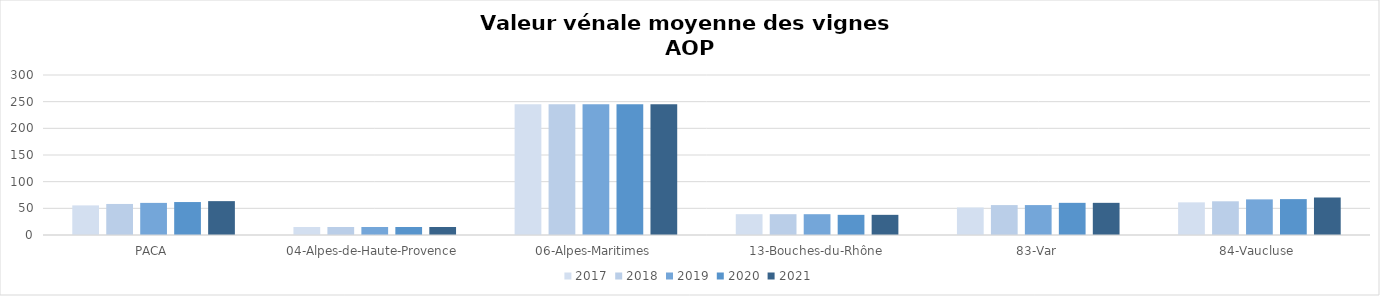
| Category | 2017 | 2018 | 2019 | 2020 | 2021 |
|---|---|---|---|---|---|
| PACA | 55.5 | 58.2 | 60.2 | 61.8 | 63.5 |
| 04-Alpes-de-Haute-Provence | 15 | 15 | 15 | 15 | 15 |
| 06-Alpes-Maritimes | 245 | 245 | 245 | 245 | 245 |
| 13-Bouches-du-Rhône | 39 | 39 | 39 | 37.8 | 37.8 |
| 83-Var | 51.6 | 56.1 | 56.1 | 60.3 | 60.3 |
| 84-Vaucluse  | 61.2 | 63.2 | 66.8 | 67.3 | 70.5 |